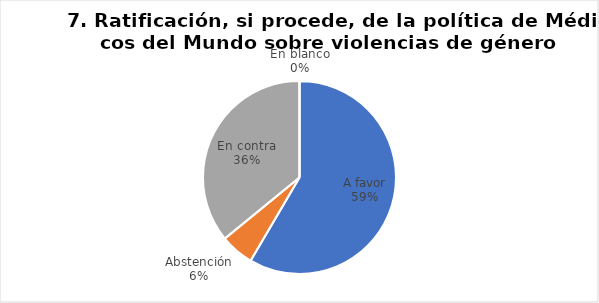
| Category | Series 0 |
|---|---|
| A favor | 83 |
| Abstención | 8 |
| En contra | 51 |
| En blanco | 0 |